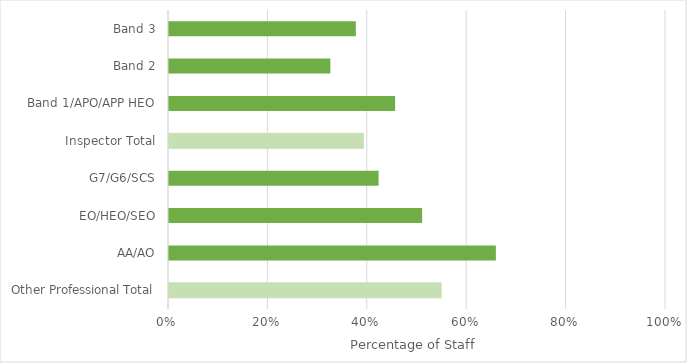
| Category | Series 0 |
|---|---|
| Other Professional Total | 0.55 |
| AA/AO | 0.66 |
| EO/HEO/SEO | 0.511 |
| G7/G6/SCS | 0.424 |
| Inspector Total | 0.393 |
| Band 1/APO/APP HEO | 0.457 |
| Band 2 | 0.327 |
| Band 3 | 0.378 |